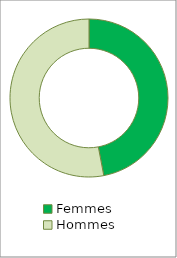
| Category | Series 0 |
|---|---|
| Femmes | 0.47 |
| Hommes | 0.53 |